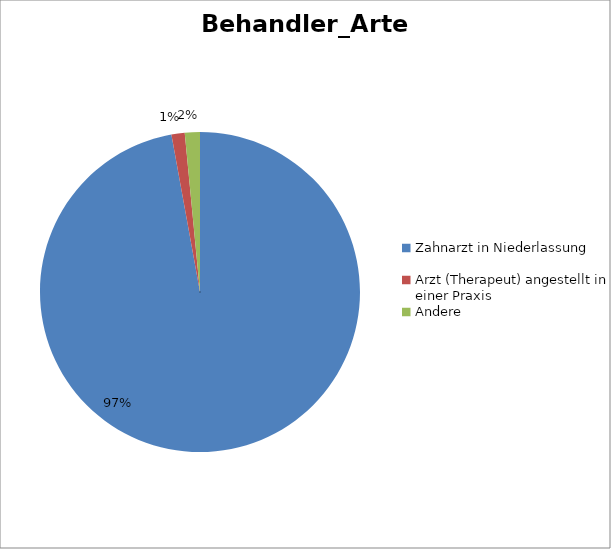
| Category | Series 0 |
|---|---|
| Zahnarzt in Niederlassung | 16457 |
| Arzt (Therapeut) angestellt in einer Praxis | 227 |
| Andere | 258 |